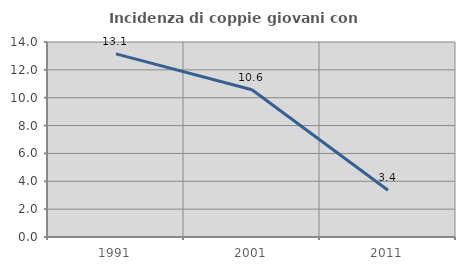
| Category | Incidenza di coppie giovani con figli |
|---|---|
| 1991.0 | 13.144 |
| 2001.0 | 10.571 |
| 2011.0 | 3.356 |